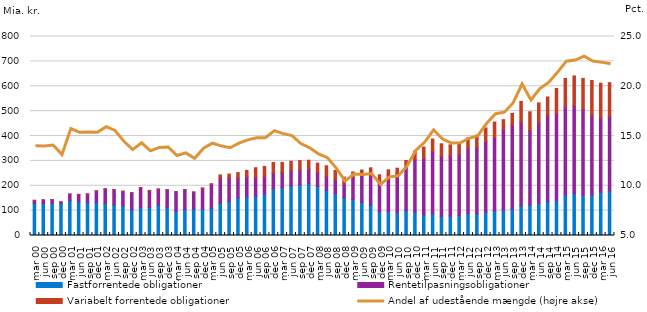
| Category | Fastforrentede obligationer | Rentetilpasningsobligationer | Variabelt forrentede obligationer |
|---|---|---|---|
| mar 00 | 129.057 | 12.359 | 0 |
| jun 00 | 128.405 | 15.019 | 0 |
| sep 00 | 129.269 | 15.352 | 0 |
| dec 00 | 129.494 | 5.895 | 0 |
| mar 01 | 140.019 | 26.621 | 0 |
| jun 01 | 135.833 | 29.386 | 0 |
| sep 01 | 132.624 | 34.41 | 0 |
| dec 01 | 132.262 | 47.312 | 0 |
| mar 02 | 127.612 | 60.396 | 0 |
| jun 02 | 123.235 | 61.138 | 0 |
| sep 02 | 118.09 | 59.892 | 0 |
| dec 02 | 104.808 | 67.098 | 0 |
| mar 03 | 111.473 | 81.461 | 0 |
| jun 03 | 113.209 | 67.982 | 0 |
| sep 03 | 122.59 | 64.152 | 0 |
| dec 03 | 111.824 | 72.321 | 0.005 |
| mar 04 | 97.861 | 78.535 | 0.005 |
| jun 04 | 104.458 | 80.075 | 0.001 |
| sep 04 | 106.579 | 68.06 | 0.001 |
| dec 04 | 106.601 | 83.058 | 1.632 |
| mar 05 | 108.731 | 96.005 | 3.8 |
| jun 05 | 129.937 | 100.993 | 12.606 |
| sep 05 | 136.838 | 94.272 | 15.881 |
| dec 05 | 151.343 | 79.945 | 21.579 |
| mar 06 | 154.682 | 80.77 | 26.167 |
| jun 06 | 157.703 | 76.283 | 38.319 |
| sep 06 | 166.764 | 68.915 | 42.003 |
| dec 06 | 187.857 | 63.366 | 42.534 |
| mar 07 | 192.012 | 61.081 | 40.739 |
| jun 07 | 198.467 | 62.637 | 37.578 |
| sep 07 | 204.262 | 57.824 | 39.059 |
| dec 07 | 208.155 | 58.828 | 35.633 |
| mar 08 | 196.817 | 55.816 | 38.35 |
| jun 08 | 181.979 | 56.533 | 41.825 |
| sep 08 | 168.589 | 55.029 | 37.727 |
| dec 08 | 150.904 | 56.799 | 26.972 |
| mar 09 | 144.377 | 88.471 | 22.62 |
| jun 09 | 132.35 | 108.88 | 22.154 |
| sep 09 | 122.942 | 127.417 | 21.713 |
| dec 09 | 95.265 | 120.793 | 27.724 |
| mar 10 | 95.826 | 147.304 | 20.904 |
| jun 10 | 91.422 | 157.978 | 21.237 |
| sep 10 | 99.17 | 175.698 | 26.684 |
| dec 10 | 93.761 | 212.654 | 32.876 |
| mar 11 | 82.028 | 228.217 | 45.56 |
| jun 11 | 86.97 | 249.591 | 51.19 |
| sep 11 | 77.563 | 241.156 | 50 |
| dec 11 | 78.047 | 241.767 | 44.829 |
| mar 12 | 79.705 | 246.026 | 48.225 |
| jun 12 | 87.599 | 261.316 | 43.145 |
| sep 12 | 86.477 | 268.245 | 48.636 |
| dec 12 | 93.628 | 283.904 | 55.046 |
| mar 13 | 97.977 | 296.382 | 61.68 |
| jun 13 | 102.602 | 323.828 | 39.322 |
| sep 13 | 105.679 | 337.888 | 47.494 |
| dec 13 | 119.615 | 335.789 | 83.449 |
| mar 14 | 122.579 | 299.969 | 74.648 |
| jun 14 | 129.296 | 324.311 | 79.485 |
| sep 14 | 136.855 | 346.732 | 73.321 |
| dec 14 | 142.123 | 349.745 | 99.058 |
| mar 15 | 162.409 | 354.818 | 114.039 |
| jun 15 | 169.143 | 353.244 | 119.122 |
| sep 15 | 161.319 | 346.554 | 123.623 |
| dec 15 | 161.947 | 321.569 | 139.753 |
| mar 16 | 173.958 | 299.678 | 138.633 |
| jun 16 | 178.873 | 299.897 | 135.613 |